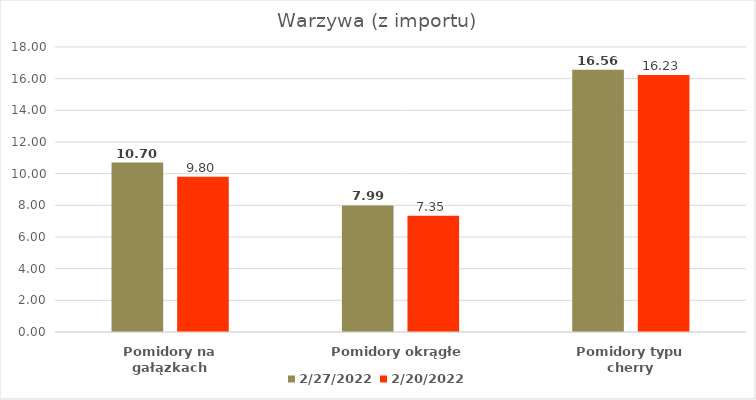
| Category | 2022-02-27 | 2022-02-20 |
|---|---|---|
| Pomidory na gałązkach | 10.7 | 9.8 |
| Pomidory okrągłe | 7.99 | 7.35 |
| Pomidory typu cherry | 16.56 | 16.23 |